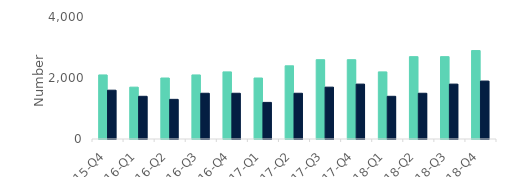
| Category | First-time
buyers | Home movers |
|---|---|---|
| 15-Q4 | 2100 | 1600 |
| 16-Q1 | 1700 | 1400 |
| 16-Q2 | 2000 | 1300 |
| 16-Q3 | 2100 | 1500 |
| 16-Q4 | 2200 | 1500 |
| 17-Q1 | 2000 | 1200 |
| 17-Q2 | 2400 | 1500 |
| 17-Q3 | 2600 | 1700 |
| 17-Q4 | 2600 | 1800 |
| 18-Q1 | 2200 | 1400 |
| 18-Q2 | 2700 | 1500 |
| 18-Q3 | 2700 | 1800 |
| 18-Q4 | 2900 | 1900 |